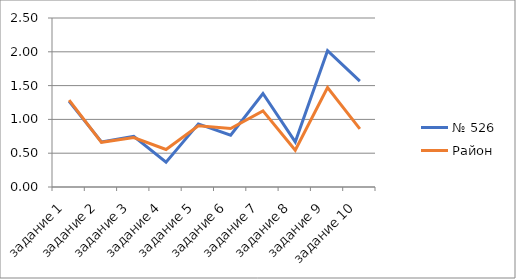
| Category | № 526 | Район  |
|---|---|---|
| задание 1 | 1.267 | 1.284 |
| задание 2 | 0.667 | 0.661 |
| задание 3 | 0.75 | 0.733 |
| задание 4 | 0.367 | 0.555 |
| задание 5 | 0.933 | 0.906 |
| задание 6 | 0.767 | 0.865 |
| задание 7 | 1.383 | 1.127 |
| задание 8 | 0.667 | 0.543 |
| задание 9 | 2.017 | 1.472 |
| задание 10 | 1.567 | 0.859 |